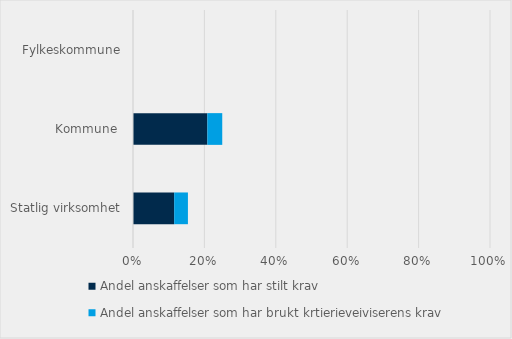
| Category | Andel anskaffelser som har stilt krav | Andel anskaffelser som har brukt krtierieveiviserens krav |
|---|---|---|
| Statlig virksomhet | 0.115 | 0.038 |
| Kommune  | 0.208 | 0.042 |
| Fylkeskommune | 0 | 0 |